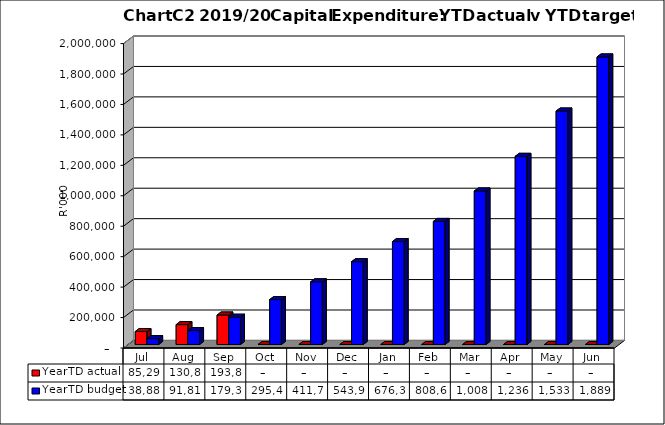
| Category | YearTD actual | YearTD budget |
|---|---|---|
| Jul | 85297669.12 | 38885000 |
| Aug | 130812960.887 | 91812000 |
| Sep | 193837445.496 | 179333000 |
| Oct | 0 | 295426000 |
| Nov | 0 | 411726000 |
| Dec | 0 | 543992000 |
| Jan | 0 | 676328000 |
| Feb | 0 | 808664000 |
| Mar | 0 | 1008547000 |
| Apr | 0 | 1236223000 |
| May | 0 | 1533926000 |
| Jun | 0 | 1889185999.6 |